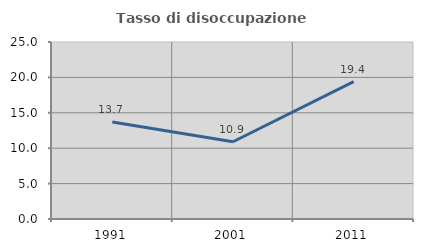
| Category | Tasso di disoccupazione giovanile  |
|---|---|
| 1991.0 | 13.71 |
| 2001.0 | 10.914 |
| 2011.0 | 19.409 |